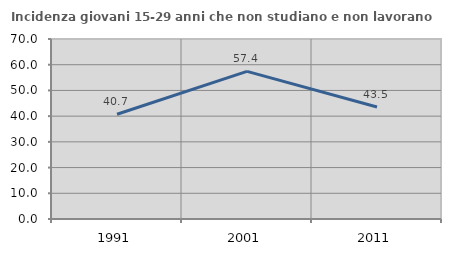
| Category | Incidenza giovani 15-29 anni che non studiano e non lavorano  |
|---|---|
| 1991.0 | 40.718 |
| 2001.0 | 57.421 |
| 2011.0 | 43.548 |